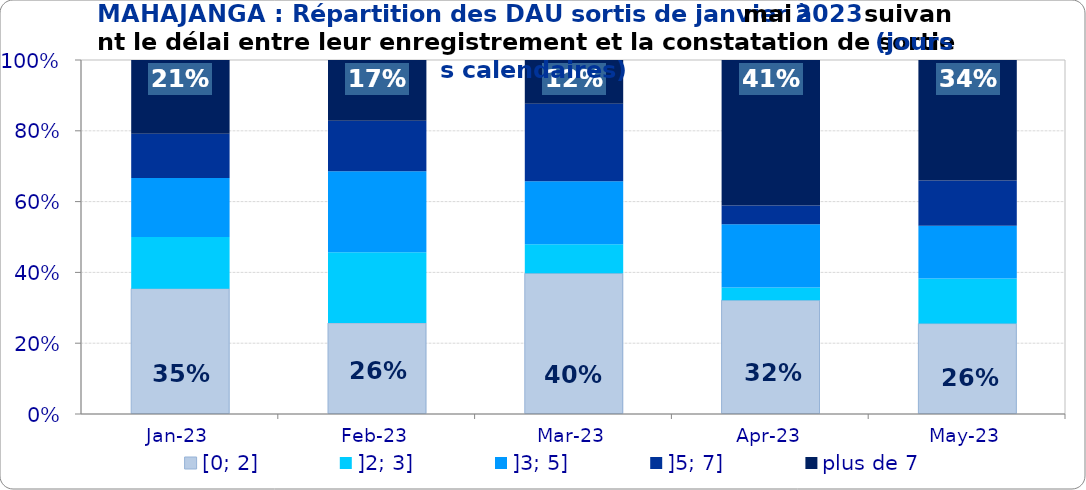
| Category | [0; 2] | ]2; 3] | ]3; 5] | ]5; 7] | plus de 7 |
|---|---|---|---|---|---|
| 2023-01-01 | 0.354 | 0.146 | 0.167 | 0.125 | 0.208 |
| 2023-02-01 | 0.257 | 0.2 | 0.229 | 0.143 | 0.171 |
| 2023-03-01 | 0.397 | 0.082 | 0.178 | 0.219 | 0.123 |
| 2023-04-01 | 0.321 | 0.036 | 0.179 | 0.054 | 0.411 |
| 2023-05-01 | 0.255 | 0.128 | 0.149 | 0.128 | 0.34 |